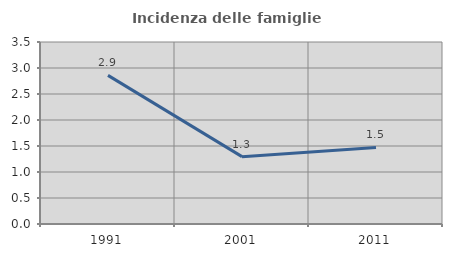
| Category | Incidenza delle famiglie numerose |
|---|---|
| 1991.0 | 2.859 |
| 2001.0 | 1.295 |
| 2011.0 | 1.471 |